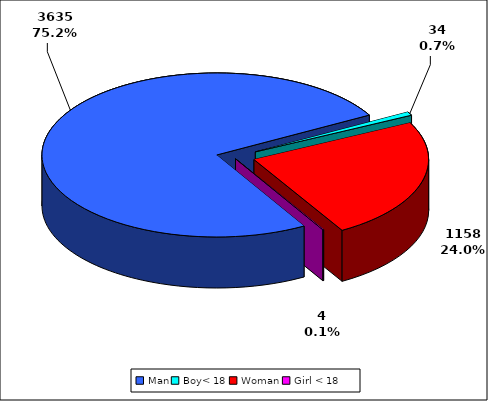
| Category | TOTAL |
|---|---|
| Man | 3635 |
| Boy< 18 | 34 |
| Woman | 1158 |
| Girl < 18 | 4 |